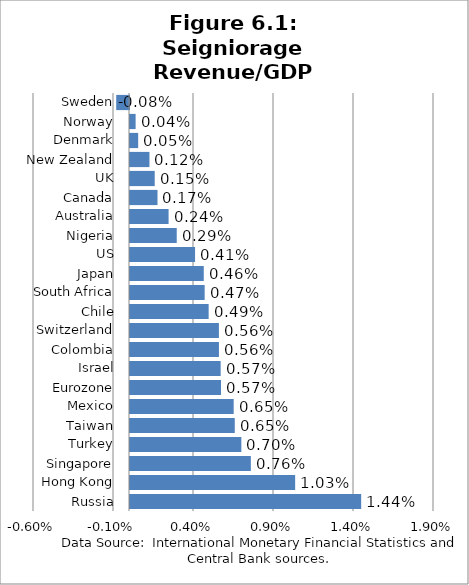
| Category | Series 0 |
|---|---|
| Russia | 0.014 |
| Hong Kong | 0.01 |
| Singapore | 0.008 |
| Turkey | 0.007 |
| Taiwan | 0.007 |
| Mexico | 0.006 |
| Eurozone | 0.006 |
| Israel | 0.006 |
| Colombia | 0.006 |
| Switzerland | 0.006 |
| Chile | 0.005 |
| South Africa | 0.005 |
| Japan | 0.005 |
| US | 0.004 |
| Nigeria | 0.003 |
| Australia | 0.002 |
| Canada | 0.002 |
| UK | 0.002 |
| New Zealand | 0.001 |
| Denmark | 0.001 |
| Norway | 0 |
| Sweden | -0.001 |